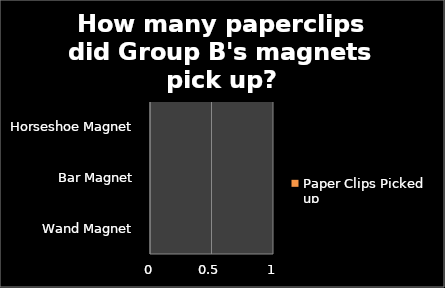
| Category | Paper Clips Picked up |
|---|---|
| Wand Magnet | 0 |
| Bar Magnet | 0 |
| Horseshoe Magnet | 0 |